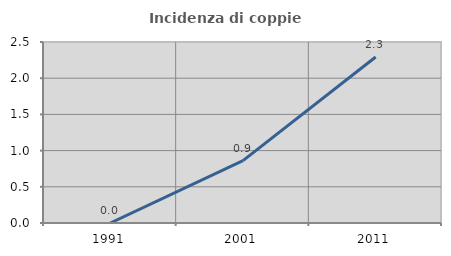
| Category | Incidenza di coppie miste |
|---|---|
| 1991.0 | 0 |
| 2001.0 | 0.862 |
| 2011.0 | 2.294 |